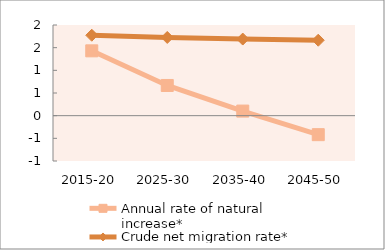
| Category | Annual rate of natural increase* | Crude net migration rate* |
|---|---|---|
| 2015-20 | 1.43 | 1.774 |
| 2025-30 | 0.666 | 1.725 |
| 2035-40 | 0.101 | 1.69 |
| 2045-50 | -0.419 | 1.664 |